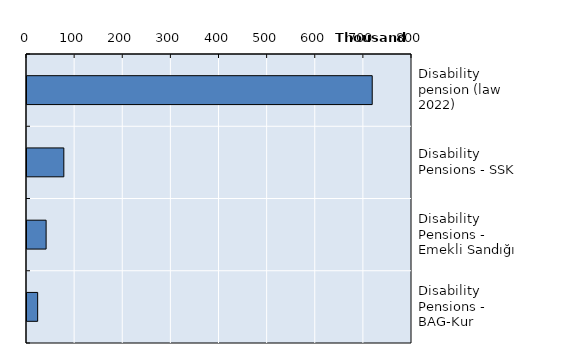
| Category | Series 0 |
|---|---|
| Disability pension (law 2022) | 717352 |
| Disability Pensions - SSK | 76554 |
| Disability Pensions - Emekli Sandığı | 39720 |
| Disability Pensions - BAG-Kur | 22166 |